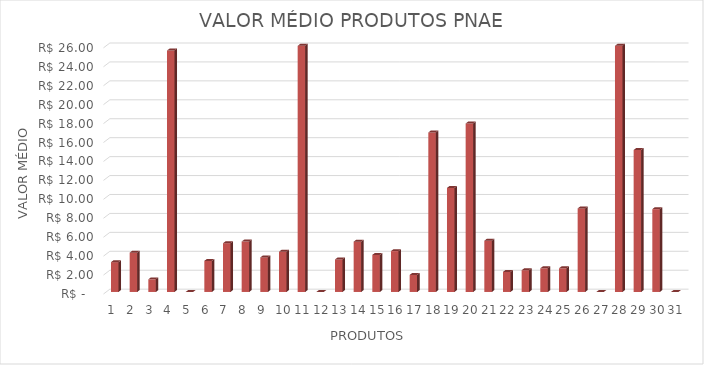
| Category | Series 0 |
|---|---|
| 0 | 3.15 |
| 1 | 4.15 |
| 2 | 1.333 |
| 3 | 25.5 |
| 4 | 0 |
| 5 | 3.283 |
| 6 | 5.15 |
| 7 | 5.327 |
| 8 | 3.65 |
| 9 | 4.25 |
| 10 | 28.75 |
| 11 | 0 |
| 12 | 3.433 |
| 13 | 5.313 |
| 14 | 3.917 |
| 15 | 4.317 |
| 16 | 1.8 |
| 17 | 16.85 |
| 18 | 10.99 |
| 19 | 17.8 |
| 20 | 5.417 |
| 21 | 2.117 |
| 22 | 2.3 |
| 23 | 2.5 |
| 24 | 2.5 |
| 25 | 8.825 |
| 26 | 0 |
| 27 | 30.9 |
| 28 | 15 |
| 29 | 8.75 |
| 30 | 0 |